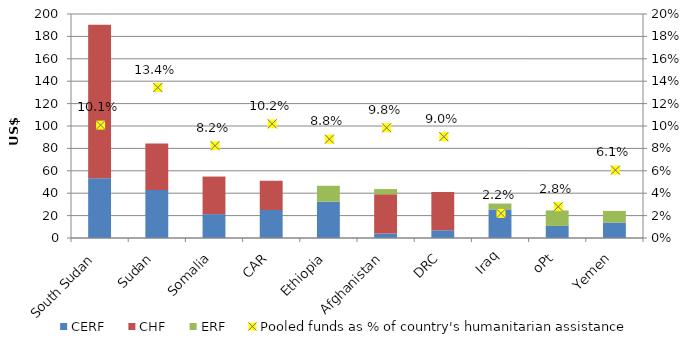
| Category | CERF | CHF | ERF |
|---|---|---|---|
| South Sudan | 53.355 | 137.065 | 0 |
| Sudan | 42.965 | 41.304 | 0 |
| Somalia | 21.318 | 33.548 | 0 |
| CAR | 24.99 | 26.122 | 0 |
| Ethiopia | 32.385 | 0 | 14.241 |
| Afghanistan | 3.968 | 35.108 | 4.629 |
| DRC | 6.915 | 34.142 | 0 |
| Iraq | 25.524 | 0 | 5.216 |
| oPt | 10.761 | 0 | 13.847 |
| Yemen | 13.816 | 0 | 10.349 |